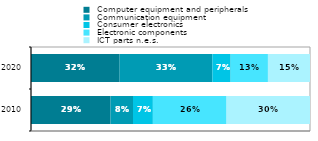
| Category |  Computer equipment and peripherals |  Communication equipment |  Consumer electronics |  Electronic components |  ICT parts n.e.s. |
|---|---|---|---|---|---|
| 2010.0 | 0.285 | 0.08 | 0.071 | 0.264 | 0.299 |
| 2020.0 | 0.318 | 0.332 | 0.066 | 0.134 | 0.151 |